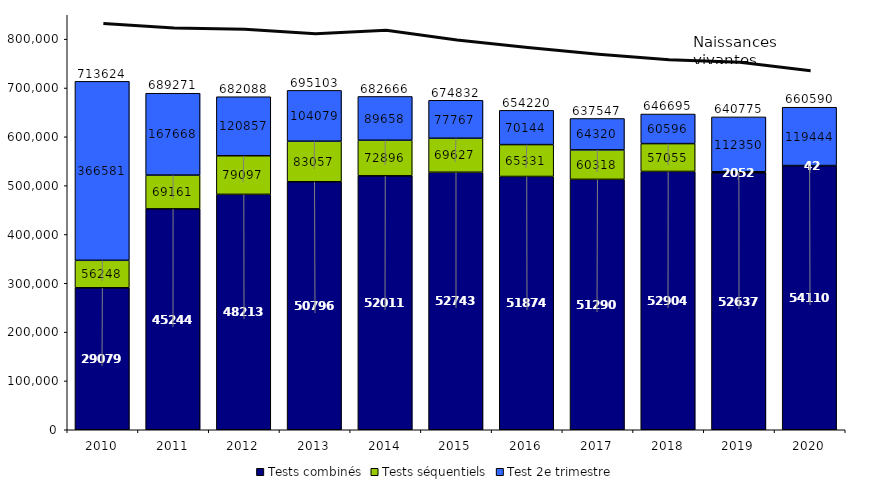
| Category | Tests combinés | Tests séquentiels | Test 2e trimestre | Total |
|---|---|---|---|---|
| 2010.0 | 290795 | 56248 | 366581 | 713624 |
| 2011.0 | 452442 | 69161 | 167668 | 689271 |
| 2012.0 | 482134 | 79097 | 120857 | 682088 |
| 2013.0 | 507967 | 83057 | 104079 | 695103 |
| 2014.0 | 520112 | 72896 | 89658 | 682666 |
| 2015.0 | 527438 | 69627 | 77767 | 674832 |
| 2016.0 | 518745 | 65331 | 70144 | 654220 |
| 2017.0 | 512909 | 60318 | 64320 | 637547 |
| 2018.0 | 529044 | 57055 | 60596 | 646695 |
| 2019.0 | 526373 | 2052 | 112350 | 640775 |
| 2020.0 | 541104 | 42 | 119444 | 660590 |